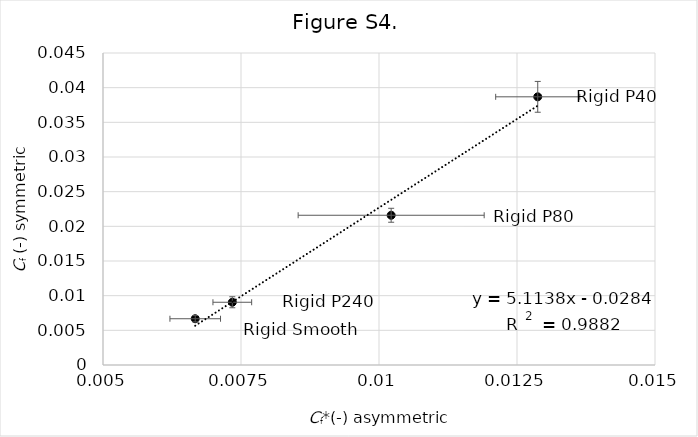
| Category | Series 0 |
|---|---|
| 0.012875657580105213 | 0.039 |
| 0.010220344537543766 | 0.022 |
| 0.007342555717757292 | 0.009 |
| 0.006670780376651422 | 0.007 |